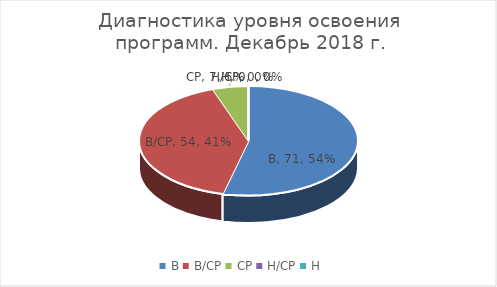
| Category | Series 0 |
|---|---|
| В | 71 |
| В/СР | 54 |
| СР | 7 |
| Н/СР | 0 |
| Н | 0 |